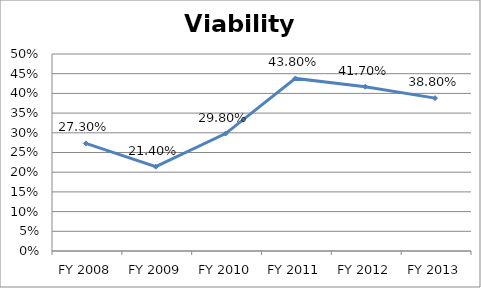
| Category | Viability ratio |
|---|---|
| FY 2013 | 0.388 |
| FY 2012 | 0.417 |
| FY 2011 | 0.438 |
| FY 2010 | 0.298 |
| FY 2009 | 0.214 |
| FY 2008 | 0.273 |